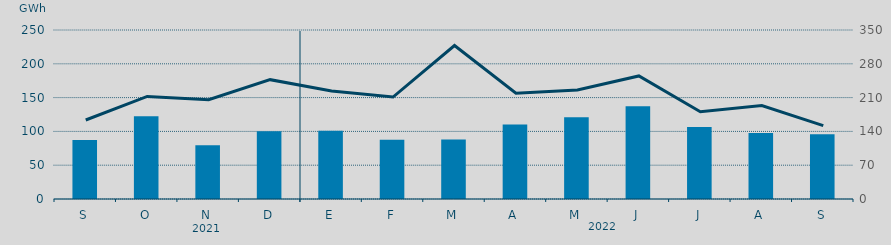
| Category | Energía a subir |
|---|---|
| S | 87.125 |
| O | 122.328 |
| N | 79.438 |
| D | 100.154 |
| E | 100.885 |
| F | 87.769 |
| M | 87.943 |
| A | 110.173 |
| M | 120.934 |
| J | 137.327 |
| J | 106.625 |
| A | 97.648 |
| S | 95.912 |